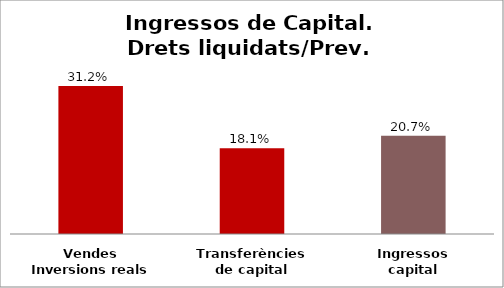
| Category | Series 0 |
|---|---|
| Vendes Inversions reals | 0.312 |
| Transferències de capital | 0.181 |
| Ingressos capital | 0.207 |